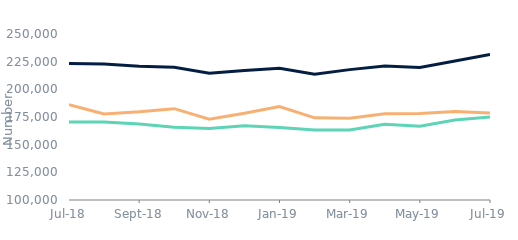
| Category | First-time
buyers | Homemovers | Remortgagors |
|---|---|---|---|
| 2018-07-01 | 170547.318 | 223301.079 | 186047.294 |
| 2018-08-01 | 170424.372 | 222910.125 | 177772.199 |
| 2018-09-01 | 168614.565 | 220923.548 | 179653.653 |
| 2018-10-01 | 165843.362 | 219879.433 | 182518.205 |
| 2018-11-01 | 164593.918 | 214478.456 | 173081.465 |
| 2018-12-01 | 167129.793 | 216927.298 | 178399.368 |
| 2019-01-01 | 165423.234 | 219056.633 | 184500.453 |
| 2019-02-01 | 163271.736 | 213651.401 | 174216.701 |
| 2019-03-01 | 163241.17 | 217804.98 | 173924.821 |
| 2019-04-01 | 168479.934 | 221045.203 | 177915.197 |
| 2019-05-01 | 166702.941 | 219792.28 | 178263.19 |
| 2019-06-01 | 172213.629 | 225526.934 | 179997.843 |
| 2019-07-01 | 174914.142 | 231602.886 | 178553.477 |